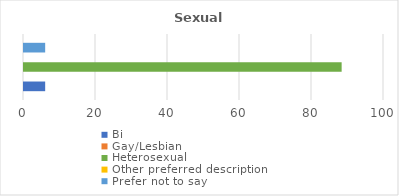
| Category | Bi | Gay/Lesbian | Heterosexual | Other preferred description | Prefer not to say |
|---|---|---|---|---|---|
| % | 5.882 | 0 | 88.235 | 0 | 5.882 |